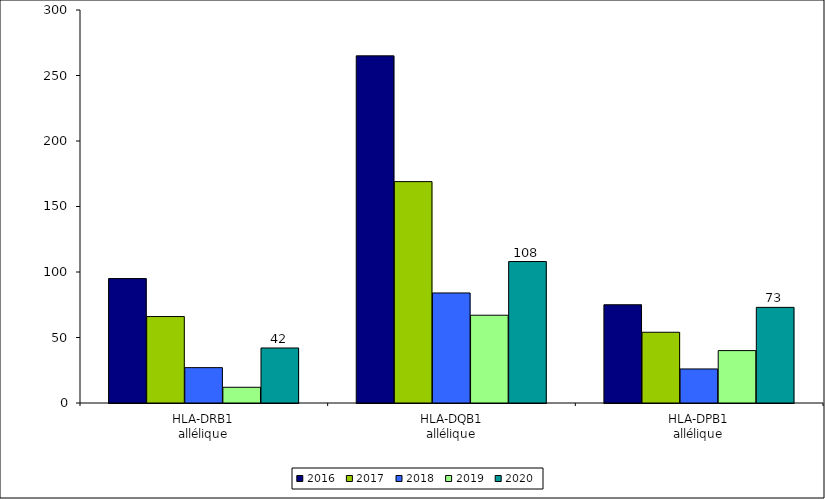
| Category | 2016 | 2017 | 2018 | 2019 | 2020 |
|---|---|---|---|---|---|
| HLA-DRB1
allélique | 95 | 66 | 27 | 12 | 42 |
| HLA-DQB1
allélique | 265 | 169 | 84 | 67 | 108 |
| HLA-DPB1
allélique | 75 | 54 | 26 | 40 | 73 |